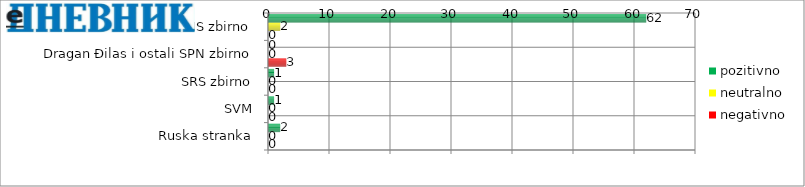
| Category | pozitivno | neutralno | negativno |
|---|---|---|---|
| Aleksandar Vučić i ostali SNS zbirno | 62 | 2 | 0 |
| Dragan Đilas i ostali SPN zbirno | 0 | 0 | 3 |
| SRS zbirno | 1 | 0 | 0 |
| SVM | 1 | 0 | 0 |
| Ruska stranka | 2 | 0 | 0 |